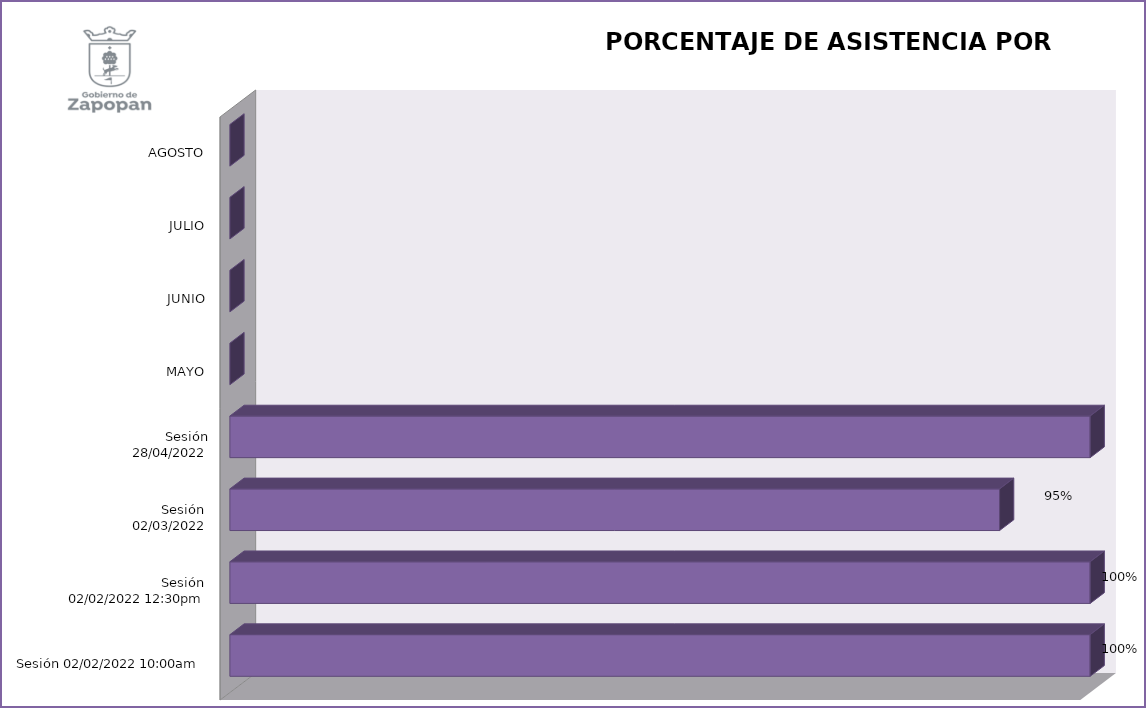
| Category | Series 0 |
|---|---|
| Sesión 02/02/2022 10:00am | 100 |
| Sesión 
02/02/2022 12:30pm | 100 |
| Sesión 
02/03/2022 | 94.737 |
| Sesión
28/04/2022 | 100 |
| MAYO | 0 |
| JUNIO | 0 |
| JULIO | 0 |
| AGOSTO | 0 |